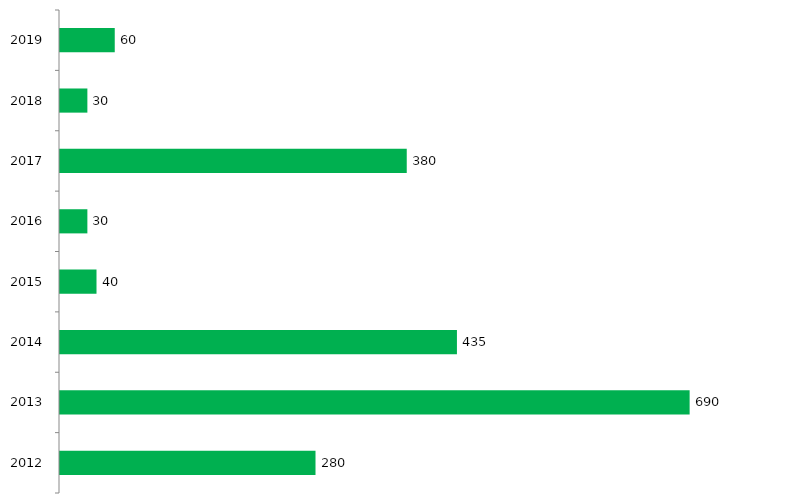
| Category | Vagas ofertadas |
|---|---|
| 2012.0 | 280 |
| 2013.0 | 690 |
| 2014.0 | 435 |
| 2015.0 | 40 |
| 2016.0 | 30 |
| 2017.0 | 380 |
| 2018.0 | 30 |
| 2019.0 | 60 |